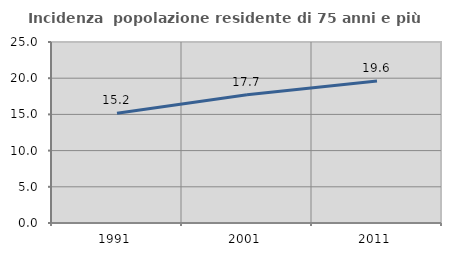
| Category | Incidenza  popolazione residente di 75 anni e più |
|---|---|
| 1991.0 | 15.152 |
| 2001.0 | 17.726 |
| 2011.0 | 19.601 |